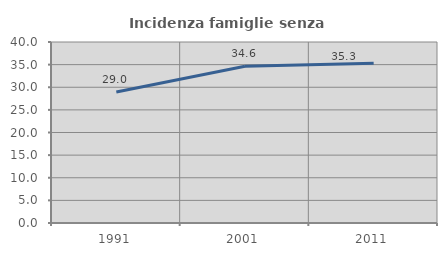
| Category | Incidenza famiglie senza nuclei |
|---|---|
| 1991.0 | 28.955 |
| 2001.0 | 34.648 |
| 2011.0 | 35.294 |